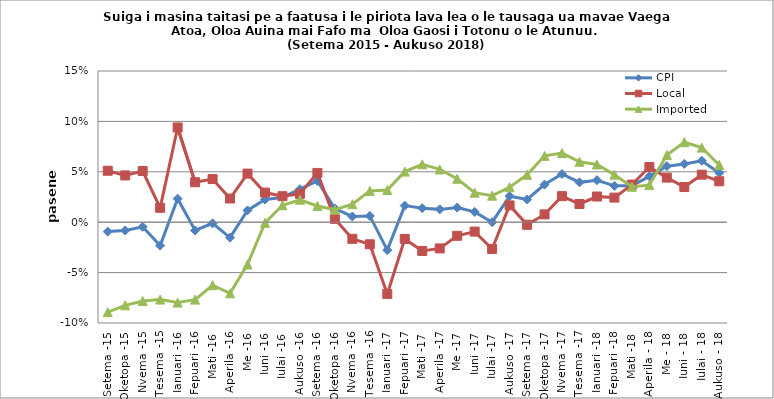
| Category | CPI | Local | Imported |
|---|---|---|---|
| Setema -15 | -0.009 | 0.051 | -0.089 |
| Oketopa -15 | -0.008 | 0.046 | -0.082 |
| Nvema -15 | -0.005 | 0.051 | -0.078 |
| Tesema -15 | -0.023 | 0.014 | -0.077 |
| Ianuari -16 | 0.023 | 0.094 | -0.08 |
| Fepuari -16 | -0.008 | 0.04 | -0.077 |
| Mati -16 | -0.001 | 0.043 | -0.063 |
| Aperila -16 | -0.015 | 0.023 | -0.071 |
| Me -16 | 0.012 | 0.048 | -0.042 |
| Iuni -16 | 0.023 | 0.029 | -0.001 |
| Iulai -16 | 0.025 | 0.026 | 0.017 |
| Aukuso -16 | 0.033 | 0.028 | 0.022 |
| Setema -16 | 0.041 | 0.049 | 0.016 |
| Oketopa -16 | 0.014 | 0.003 | 0.012 |
| Nvema -16 | 0.006 | -0.016 | 0.018 |
| Tesema -16 | 0.006 | -0.022 | 0.031 |
| Ianuari -17 | -0.028 | -0.071 | 0.032 |
| Fepuari -17 | 0.016 | -0.017 | 0.05 |
| Mati -17 | 0.014 | -0.029 | 0.057 |
| Aperila -17 | 0.013 | -0.026 | 0.052 |
| Me -17 | 0.015 | -0.013 | 0.043 |
| Iuni -17 | 0.01 | -0.009 | 0.029 |
| Iulai -17 | 0 | -0.027 | 0.026 |
| Aukuso -17 | 0.026 | 0.017 | 0.035 |
| Setema -17 | 0.023 | -0.003 | 0.047 |
| Oketopa -17 | 0.037 | 0.008 | 0.066 |
| Nvema -17 | 0.048 | 0.026 | 0.069 |
| Tesema -17 | 0.04 | 0.018 | 0.06 |
| Ianuari -18 | 0.042 | 0.025 | 0.057 |
| Fepuari -18 | 0.036 | 0.024 | 0.047 |
| Mati -18 | 0.036 | 0.037 | 0.035 |
| Aperila - 18 | 0.045 | 0.055 | 0.037 |
| Me - 18 | 0.056 | 0.044 | 0.067 |
| Iuni - 18 | 0.058 | 0.035 | 0.079 |
| Iulai - 18 | 0.061 | 0.047 | 0.074 |
| Aukuso - 18 | 0.049 | 0.041 | 0.057 |